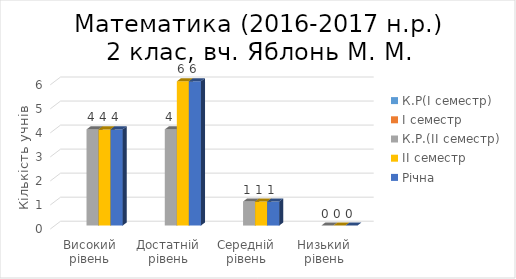
| Category | К.Р(І семестр) | І семестр | К.Р.(ІІ семестр) | ІІ семестр | Річна |
|---|---|---|---|---|---|
| Високий рівень |  |  | 4 | 4 | 4 |
| Достатній рівень |  |  | 4 | 6 | 6 |
| Середній рівень |  |  | 1 | 1 | 1 |
| Низький рівень |  |  | 0 | 0 | 0 |